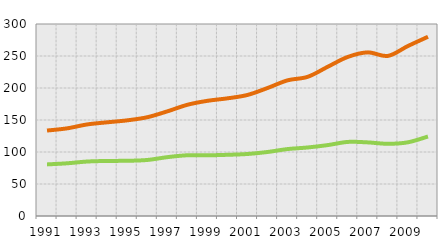
| Category | Unit Labor
Costs Index | Labor 
Compensation
 Index |
|---|---|---|
| 1991.0 | 80.623 | 52.91 |
| 1992.0 | 82.34 | 54.594 |
| 1993.0 | 85.09 | 57.97 |
| 1994.0 | 86.015 | 60.377 |
| 1995.0 | 86.263 | 63.199 |
| 1996.0 | 87.532 | 66.79 |
| 1997.0 | 91.951 | 71.541 |
| 1998.0 | 94.912 | 78.846 |
| 1999.0 | 94.845 | 85.135 |
| 2000.0 | 95.609 | 88.237 |
| 2001.0 | 96.888 | 92.257 |
| 2002.0 | 100 | 100 |
| 2003.0 | 104.602 | 107.395 |
| 2004.0 | 107.059 | 110.403 |
| 2005.0 | 110.79 | 122.362 |
| 2006.0 | 115.745 | 132.795 |
| 2007.0 | 115.008 | 140.67 |
| 2008.0 | 112.828 | 137.328 |
| 2009.0 | 115.153 | 150.448 |
| 2010.0 | 124.195 | 155.85 |